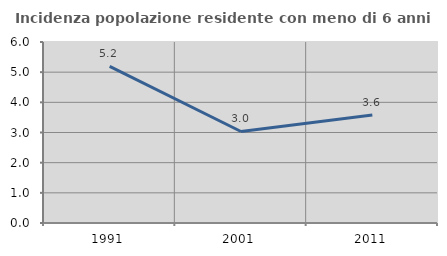
| Category | Incidenza popolazione residente con meno di 6 anni |
|---|---|
| 1991.0 | 5.189 |
| 2001.0 | 3.034 |
| 2011.0 | 3.578 |